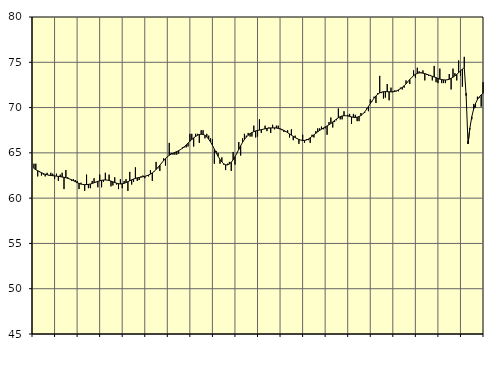
| Category | Piggar | Samtliga anställda (inkl. anställda utomlands) |
|---|---|---|
| nan | 63.8 | 63.28 |
| 1.0 | 63.8 | 63.14 |
| 1.0 | 62.4 | 63.03 |
| 1.0 | 63 | 62.91 |
| 1.0 | 62.5 | 62.81 |
| 1.0 | 62.6 | 62.71 |
| 1.0 | 62.4 | 62.64 |
| 1.0 | 62.8 | 62.58 |
| 1.0 | 62.5 | 62.54 |
| 1.0 | 62.8 | 62.5 |
| 1.0 | 62.7 | 62.48 |
| 1.0 | 62.1 | 62.46 |
| nan | 62.7 | 62.43 |
| 2.0 | 61.9 | 62.4 |
| 2.0 | 62.6 | 62.37 |
| 2.0 | 62.8 | 62.33 |
| 2.0 | 61 | 62.3 |
| 2.0 | 63.1 | 62.25 |
| 2.0 | 62.3 | 62.19 |
| 2.0 | 62.1 | 62.12 |
| 2.0 | 61.9 | 62.03 |
| 2.0 | 62.1 | 61.93 |
| 2.0 | 62 | 61.82 |
| 2.0 | 61.9 | 61.71 |
| nan | 61 | 61.62 |
| 3.0 | 61.7 | 61.55 |
| 3.0 | 61.5 | 61.51 |
| 3.0 | 60.8 | 61.49 |
| 3.0 | 62.6 | 61.5 |
| 3.0 | 61.1 | 61.52 |
| 3.0 | 61.1 | 61.56 |
| 3.0 | 61.9 | 61.62 |
| 3.0 | 62.2 | 61.7 |
| 3.0 | 61.8 | 61.77 |
| 3.0 | 61.2 | 61.85 |
| 3.0 | 62.6 | 61.91 |
| nan | 61.2 | 61.97 |
| 4.0 | 61.8 | 62 |
| 4.0 | 62.8 | 62.01 |
| 4.0 | 62 | 61.99 |
| 4.0 | 62.6 | 61.95 |
| 4.0 | 61.3 | 61.88 |
| 4.0 | 61.4 | 61.8 |
| 4.0 | 62.3 | 61.72 |
| 4.0 | 61.5 | 61.65 |
| 4.0 | 61 | 61.59 |
| 4.0 | 62.1 | 61.57 |
| 4.0 | 61.1 | 61.59 |
| nan | 61.9 | 61.64 |
| 5.0 | 62.1 | 61.72 |
| 5.0 | 60.8 | 61.82 |
| 5.0 | 62.9 | 61.92 |
| 5.0 | 61.5 | 62.02 |
| 5.0 | 61.8 | 62.11 |
| 5.0 | 63.4 | 62.18 |
| 5.0 | 61.9 | 62.24 |
| 5.0 | 62 | 62.28 |
| 5.0 | 62.4 | 62.32 |
| 5.0 | 62.5 | 62.36 |
| 5.0 | 62.2 | 62.4 |
| nan | 62.5 | 62.47 |
| 6.0 | 62.4 | 62.55 |
| 6.0 | 63.1 | 62.66 |
| 6.0 | 61.9 | 62.79 |
| 6.0 | 63 | 62.96 |
| 6.0 | 64 | 63.16 |
| 6.0 | 63.3 | 63.39 |
| 6.0 | 63 | 63.64 |
| 6.0 | 63.9 | 63.89 |
| 6.0 | 64.4 | 64.14 |
| 6.0 | 63.6 | 64.36 |
| 6.0 | 64.6 | 64.57 |
| nan | 66.1 | 64.73 |
| 7.0 | 65 | 64.86 |
| 7.0 | 64.8 | 64.96 |
| 7.0 | 64.8 | 65.05 |
| 7.0 | 64.8 | 65.14 |
| 7.0 | 64.9 | 65.24 |
| 7.0 | 65.4 | 65.36 |
| 7.0 | 65.6 | 65.5 |
| 7.0 | 65.6 | 65.68 |
| 7.0 | 65.6 | 65.87 |
| 7.0 | 65.7 | 66.08 |
| 7.0 | 67.1 | 66.29 |
| nan | 67.1 | 66.48 |
| 8.0 | 65.7 | 66.65 |
| 8.0 | 67.1 | 66.81 |
| 8.0 | 67.1 | 66.94 |
| 8.0 | 66.1 | 67.03 |
| 8.0 | 67.5 | 67.06 |
| 8.0 | 67.5 | 67.04 |
| 8.0 | 66.6 | 66.94 |
| 8.0 | 67.1 | 66.76 |
| 8.0 | 66.9 | 66.51 |
| 8.0 | 66.6 | 66.2 |
| 8.0 | 66.5 | 65.83 |
| nan | 63.8 | 65.42 |
| 9.0 | 65.2 | 65.01 |
| 9.0 | 65 | 64.62 |
| 9.0 | 63.8 | 64.27 |
| 9.0 | 64.5 | 63.99 |
| 9.0 | 63.7 | 63.79 |
| 9.0 | 63.1 | 63.68 |
| 9.0 | 63.8 | 63.67 |
| 9.0 | 64 | 63.77 |
| 9.0 | 63 | 63.96 |
| 9.0 | 65.1 | 64.23 |
| 9.0 | 63.7 | 64.57 |
| nan | 65 | 64.96 |
| 10.0 | 66.2 | 65.38 |
| 10.0 | 64.7 | 65.78 |
| 10.0 | 66.6 | 66.15 |
| 10.0 | 67.1 | 66.47 |
| 10.0 | 66.9 | 66.73 |
| 10.0 | 67.2 | 66.95 |
| 10.0 | 66.8 | 67.12 |
| 10.0 | 66.8 | 67.24 |
| 10.0 | 68 | 67.34 |
| 10.0 | 66.7 | 67.42 |
| 10.0 | 66.8 | 67.48 |
| nan | 68.7 | 67.51 |
| 11.0 | 67.2 | 67.56 |
| 11.0 | 67.6 | 67.61 |
| 11.0 | 68 | 67.66 |
| 11.0 | 67.4 | 67.7 |
| 11.0 | 67.8 | 67.73 |
| 11.0 | 67.2 | 67.75 |
| 11.0 | 68.1 | 67.76 |
| 11.0 | 67.6 | 67.76 |
| 11.0 | 68 | 67.74 |
| 11.0 | 68 | 67.7 |
| 11.0 | 67.6 | 67.66 |
| nan | 67.5 | 67.58 |
| 12.0 | 67.3 | 67.48 |
| 12.0 | 67.3 | 67.36 |
| 12.0 | 67.5 | 67.23 |
| 12.0 | 66.7 | 67.09 |
| 12.0 | 67.6 | 66.95 |
| 12.0 | 66.4 | 66.82 |
| 12.0 | 66.9 | 66.69 |
| 12.0 | 66.6 | 66.58 |
| 12.0 | 66 | 66.48 |
| 12.0 | 66.4 | 66.41 |
| 12.0 | 67 | 66.37 |
| nan | 66.1 | 66.37 |
| 13.0 | 66.5 | 66.42 |
| 13.0 | 66.4 | 66.52 |
| 13.0 | 66.1 | 66.66 |
| 13.0 | 67 | 66.82 |
| 13.0 | 66.7 | 66.99 |
| 13.0 | 67.4 | 67.16 |
| 13.0 | 67.7 | 67.32 |
| 13.0 | 67.7 | 67.47 |
| 13.0 | 67.9 | 67.61 |
| 13.0 | 67.6 | 67.74 |
| 13.0 | 67.7 | 67.86 |
| nan | 67 | 67.97 |
| 14.0 | 68.4 | 68.1 |
| 14.0 | 68.9 | 68.25 |
| 14.0 | 67.8 | 68.41 |
| 14.0 | 68.4 | 68.57 |
| 14.0 | 68.6 | 68.74 |
| 14.0 | 69.9 | 68.88 |
| 14.0 | 68.7 | 69 |
| 14.0 | 68.7 | 69.07 |
| 14.0 | 69.6 | 69.11 |
| 14.0 | 69.1 | 69.1 |
| 14.0 | 69.2 | 69.07 |
| nan | 69.3 | 69.02 |
| 15.0 | 68.2 | 68.97 |
| 15.0 | 69.3 | 68.92 |
| 15.0 | 69.2 | 68.91 |
| 15.0 | 68.5 | 68.94 |
| 15.0 | 68.5 | 69.01 |
| 15.0 | 69.4 | 69.12 |
| 15.0 | 69.3 | 69.29 |
| 15.0 | 69.4 | 69.52 |
| 15.0 | 69.9 | 69.8 |
| 15.0 | 69.6 | 70.11 |
| 15.0 | 70.9 | 70.44 |
| nan | 70.7 | 70.75 |
| 16.0 | 71.2 | 71.04 |
| 16.0 | 70.5 | 71.29 |
| 16.0 | 71.6 | 71.48 |
| 16.0 | 73.5 | 71.62 |
| 16.0 | 71.6 | 71.7 |
| 16.0 | 71 | 71.75 |
| 16.0 | 71.1 | 71.76 |
| 16.0 | 72.6 | 71.75 |
| 16.0 | 70.8 | 71.74 |
| 16.0 | 72.2 | 71.73 |
| 16.0 | 71.7 | 71.75 |
| nan | 71.9 | 71.78 |
| 17.0 | 71.8 | 71.85 |
| 17.0 | 71.8 | 71.95 |
| 17.0 | 72.2 | 72.08 |
| 17.0 | 72 | 72.23 |
| 17.0 | 72.2 | 72.41 |
| 17.0 | 73 | 72.62 |
| 17.0 | 72.8 | 72.86 |
| 17.0 | 72.6 | 73.1 |
| 17.0 | 73.3 | 73.32 |
| 17.0 | 74.1 | 73.52 |
| 17.0 | 73.3 | 73.67 |
| nan | 74.4 | 73.77 |
| 18.0 | 74 | 73.83 |
| 18.0 | 73.9 | 73.83 |
| 18.0 | 74.1 | 73.8 |
| 18.0 | 73 | 73.75 |
| 18.0 | 73.6 | 73.68 |
| 18.0 | 73.5 | 73.61 |
| 18.0 | 73.6 | 73.53 |
| 18.0 | 73 | 73.45 |
| 18.0 | 74.6 | 73.38 |
| 18.0 | 72.8 | 73.3 |
| 18.0 | 72.7 | 73.22 |
| nan | 74.3 | 73.14 |
| 19.0 | 72.7 | 73.09 |
| 19.0 | 72.7 | 73.06 |
| 19.0 | 72.7 | 73.05 |
| 19.0 | 73.1 | 73.07 |
| 19.0 | 73.7 | 73.13 |
| 19.0 | 72 | 73.23 |
| 19.0 | 74.3 | 73.35 |
| 19.0 | 73.8 | 73.5 |
| 19.0 | 73 | 73.67 |
| 19.0 | 75.2 | 73.86 |
| 19.0 | 73.5 | 74.05 |
| nan | 72.3 | 74.24 |
| 20.0 | 75.6 | 74.42 |
| 20.0 | 71.6 | 71.3 |
| 20.0 | 66.3 | 66 |
| 20.0 | 67.7 | 67.75 |
| 20.0 | 68.7 | 68.99 |
| 20.0 | 70.4 | 69.85 |
| 20.0 | 70 | 70.46 |
| 20.0 | 71.2 | 70.88 |
| 20.0 | 71.1 | 71.18 |
| 20.0 | 70.1 | 71.4 |
| 20.0 | 72.8 | 71.57 |